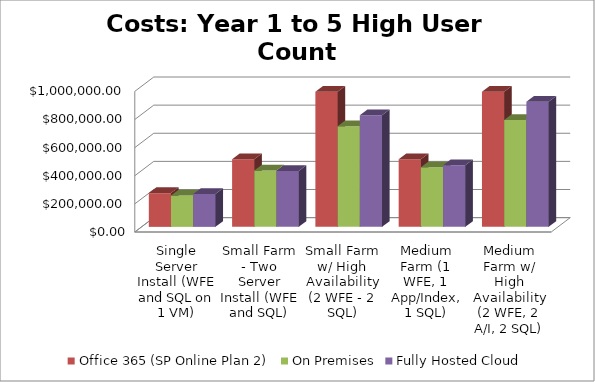
| Category | Office 365 (SP Online Plan 2) | On Premises | Fully Hosted Cloud |
|---|---|---|---|
| Single Server Install (WFE and SQL on 1 VM) | 240000 | 223322.828 | 233700 |
| Small Farm - Two Server Install (WFE and SQL) | 480000 | 401326.068 | 396600 |
| Small Farm w/ High Availability (2 WFE - 2 SQL) | 960000 | 714718.957 | 793500 |
| Medium Farm (1 WFE, 1 App/Index, 1 SQL) | 480000 | 423846.631 | 438600 |
| Medium Farm w/ High Availability (2 WFE, 2 A/I, 2 SQL) | 960000 | 759849.217 | 888900 |